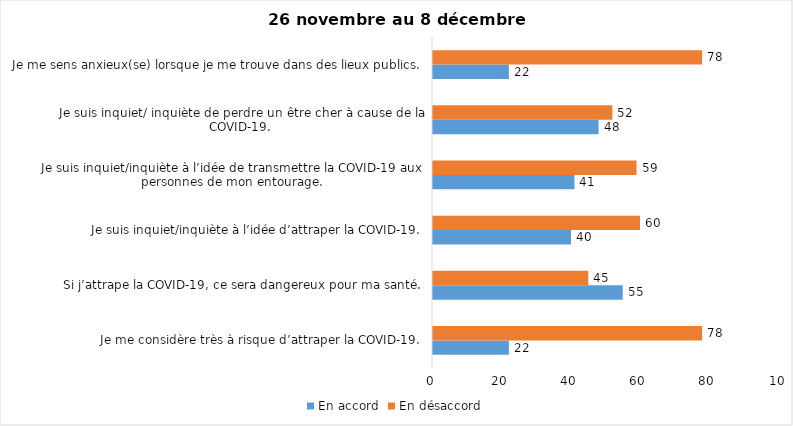
| Category | En accord | En désaccord |
|---|---|---|
| Je me considère très à risque d’attraper la COVID-19. | 22 | 78 |
| Si j’attrape la COVID-19, ce sera dangereux pour ma santé. | 55 | 45 |
| Je suis inquiet/inquiète à l’idée d’attraper la COVID-19. | 40 | 60 |
| Je suis inquiet/inquiète à l’idée de transmettre la COVID-19 aux personnes de mon entourage. | 41 | 59 |
| Je suis inquiet/ inquiète de perdre un être cher à cause de la COVID-19. | 48 | 52 |
| Je me sens anxieux(se) lorsque je me trouve dans des lieux publics. | 22 | 78 |